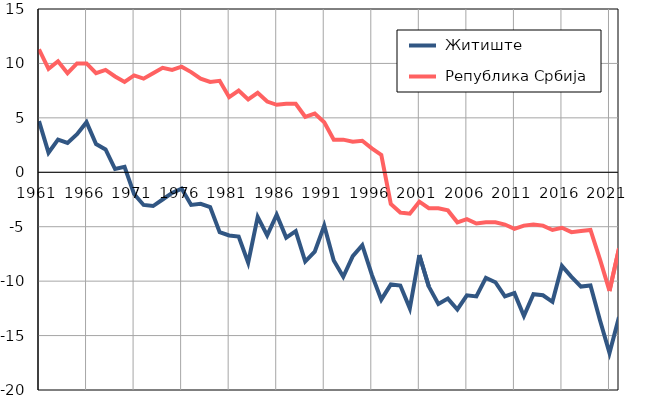
| Category |  Житиште |  Република Србија |
|---|---|---|
| 1961.0 | 4.7 | 11.3 |
| 1962.0 | 1.8 | 9.5 |
| 1963.0 | 3 | 10.2 |
| 1964.0 | 2.7 | 9.1 |
| 1965.0 | 3.5 | 10 |
| 1966.0 | 4.6 | 10 |
| 1967.0 | 2.6 | 9.1 |
| 1968.0 | 2.1 | 9.4 |
| 1969.0 | 0.3 | 8.8 |
| 1970.0 | 0.5 | 8.3 |
| 1971.0 | -2 | 8.9 |
| 1972.0 | -3 | 8.6 |
| 1973.0 | -3.1 | 9.1 |
| 1974.0 | -2.5 | 9.6 |
| 1975.0 | -1.9 | 9.4 |
| 1976.0 | -1.5 | 9.7 |
| 1977.0 | -3 | 9.2 |
| 1978.0 | -2.9 | 8.6 |
| 1979.0 | -3.2 | 8.3 |
| 1980.0 | -5.5 | 8.4 |
| 1981.0 | -5.8 | 6.9 |
| 1982.0 | -5.9 | 7.5 |
| 1983.0 | -8.3 | 6.7 |
| 1984.0 | -4.1 | 7.3 |
| 1985.0 | -5.8 | 6.5 |
| 1986.0 | -3.9 | 6.2 |
| 1987.0 | -6 | 6.3 |
| 1988.0 | -5.4 | 6.3 |
| 1989.0 | -8.2 | 5.1 |
| 1990.0 | -7.3 | 5.4 |
| 1991.0 | -4.9 | 4.6 |
| 1992.0 | -8.1 | 3 |
| 1993.0 | -9.6 | 3 |
| 1994.0 | -7.7 | 2.8 |
| 1995.0 | -6.7 | 2.9 |
| 1996.0 | -9.4 | 2.2 |
| 1997.0 | -11.7 | 1.6 |
| 1998.0 | -10.3 | -2.9 |
| 1999.0 | -10.4 | -3.7 |
| 2000.0 | -12.5 | -3.8 |
| 2001.0 | -7.6 | -2.7 |
| 2002.0 | -10.5 | -3.3 |
| 2003.0 | -12.1 | -3.3 |
| 2004.0 | -11.6 | -3.5 |
| 2005.0 | -12.6 | -4.6 |
| 2006.0 | -11.3 | -4.3 |
| 2007.0 | -11.4 | -4.7 |
| 2008.0 | -9.7 | -4.6 |
| 2009.0 | -10.1 | -4.6 |
| 2010.0 | -11.4 | -4.8 |
| 2011.0 | -11.1 | -5.2 |
| 2012.0 | -13.2 | -4.9 |
| 2013.0 | -11.2 | -4.8 |
| 2014.0 | -11.3 | -4.9 |
| 2015.0 | -11.9 | -5.3 |
| 2016.0 | -8.6 | -5.1 |
| 2017.0 | -9.6 | -5.5 |
| 2018.0 | -10.5 | -5.4 |
| 2019.0 | -10.4 | -5.3 |
| 2020.0 | -13.6 | -8 |
| 2021.0 | -16.6 | -10.9 |
| 2022.0 | -13.3 | -7 |